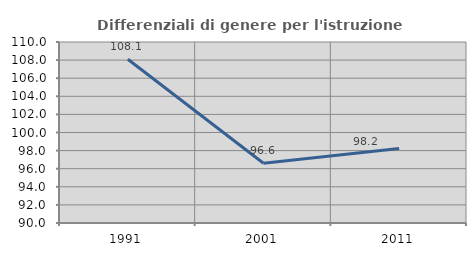
| Category | Differenziali di genere per l'istruzione superiore |
|---|---|
| 1991.0 | 108.093 |
| 2001.0 | 96.599 |
| 2011.0 | 98.23 |